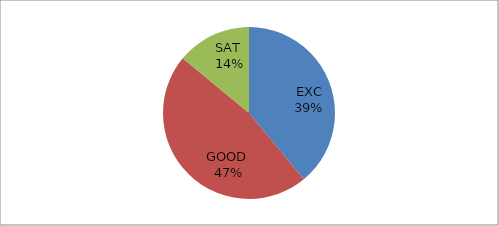
| Category | Series 0 |
|---|---|
| EXC | 39 |
| GOOD  | 47 |
| SAT  | 14 |